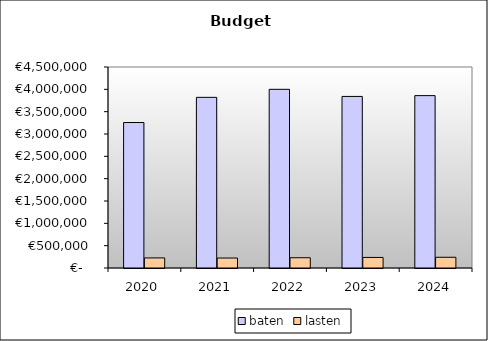
| Category | baten | lasten |
|---|---|---|
| 2020.0 | 3256877.489 | 225475.512 |
| 2021.0 | 3820580.504 | 223012.8 |
| 2022.0 | 4000445.219 | 229577.6 |
| 2023.0 | 3841188.804 | 236268.8 |
| 2024.0 | 3859193.254 | 240211.2 |